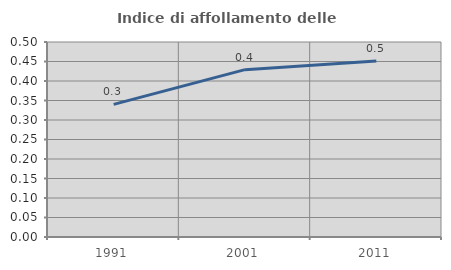
| Category | Indice di affollamento delle abitazioni  |
|---|---|
| 1991.0 | 0.34 |
| 2001.0 | 0.429 |
| 2011.0 | 0.451 |